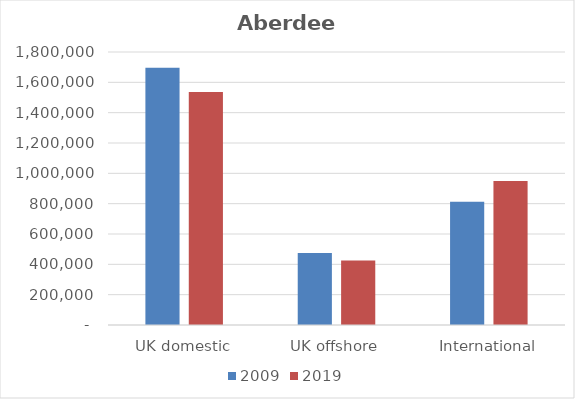
| Category | 2009 | 2019 |
|---|---|---|
| UK domestic | 1696846 | 1536367 |
| UK offshore | 474940 | 425152 |
| International | 812198 | 948869 |